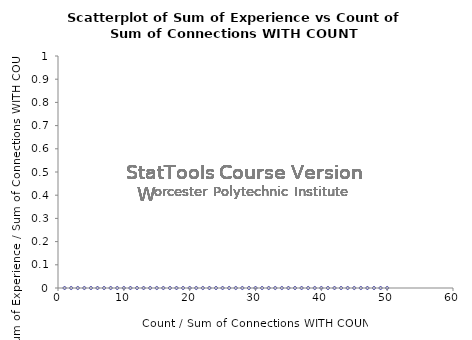
| Category | Series 0 |
|---|---|
| 1.0 | 5 |
| 2.0 | 8 |
| 3.0 | 6 |
| 4.0 | 5 |
| 5.0 | 5 |
| 6.0 | 8 |
| 7.0 | 4 |
| 8.0 | 8 |
| 9.0 | 9 |
| 10.0 | 5 |
| 11.0 | 5 |
| 12.0 | 7 |
| 13.0 | 7 |
| 14.0 | 6 |
| 15.0 | 6 |
| 16.0 | 6 |
| 17.0 | 5 |
| 18.0 | 6 |
| 19.0 | 3 |
| 20.0 | 7 |
| 21.0 | 4 |
| 22.0 | 4 |
| 23.0 | 5 |
| 24.0 | 4 |
| 25.0 | 8 |
| 26.0 | 5 |
| 27.0 | 9 |
| 28.0 | 4 |
| 29.0 | 5 |
| 30.0 | 7 |
| 31.0 | 7 |
| 32.0 | 6 |
| 33.0 | 5 |
| 34.0 | 8 |
| 35.0 | 6 |
| 36.0 | 8 |
| 37.0 | 6 |
| 38.0 | 4 |
| 39.0 | 4 |
| 40.0 | 9 |
| 41.0 | 3 |
| 42.0 | 0 |
| 43.0 | 0 |
| 44.0 | 0 |
| 45.0 | 6 |
| 46.0 | 6 |
| 47.0 | 6 |
| 48.0 | 7 |
| 49.0 | 4 |
| 50.0 | 7 |